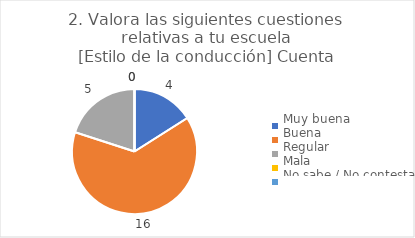
| Category | 2. Valora las siguientes cuestiones relativas a tu escuela
[Estilo de la conducción] |
|---|---|
| Muy buena  | 0.16 |
| Buena  | 0.64 |
| Regular  | 0.2 |
| Mala  | 0 |
| No sabe / No contesta | 0 |